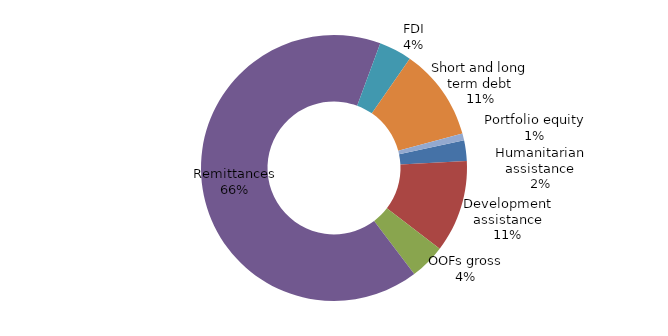
| Category | Series 0 |
|---|---|
| Humanitarian assistance | 0.529 |
| Development assistance | 2.383 |
| OOFs gross | 0.916 |
| Remittances | 14.007 |
| FDI | 0.847 |
| Short and long term debt | 2.375 |
| Portfolio equity | 0.178 |